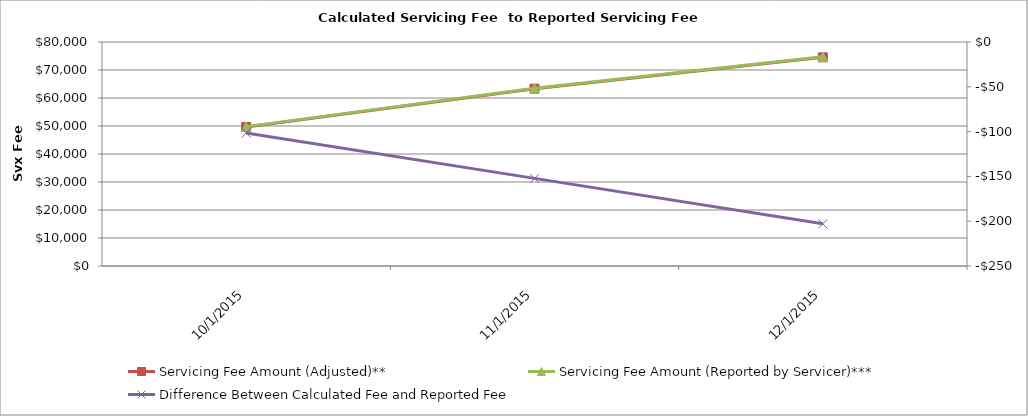
| Category | Servicing Fee Amount (Adjusted)** | Servicing Fee Amount (Reported by Servicer)*** |
|---|---|---|
| 10/31/15 | 49673.22 | 49774.7 |
| 11/30/15 | 63324.44 | 63476.66 |
| 12/31/15 | 74522.84 | 74725.8 |